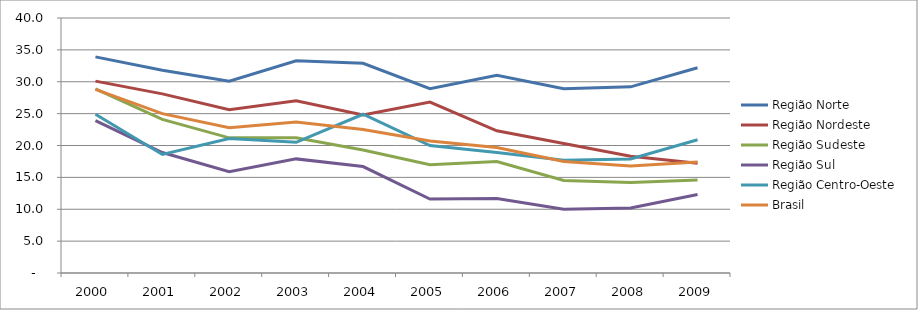
| Category | Região Norte | Região Nordeste | Região Sudeste | Região Sul | Região Centro-Oeste | Brasil |
|---|---|---|---|---|---|---|
| 2000.0 | 33.9 | 30.1 | 28.9 | 23.9 | 24.9 | 28.8 |
| 2001.0 | 31.8 | 28.1 | 24.1 | 18.9 | 18.6 | 25 |
| 2002.0 | 30.1 | 25.6 | 21.2 | 15.9 | 21.1 | 22.8 |
| 2003.0 | 33.3 | 27 | 21.2 | 17.9 | 20.5 | 23.7 |
| 2004.0 | 32.9 | 24.8 | 19.3 | 16.7 | 24.9 | 22.5 |
| 2005.0 | 28.9 | 26.8 | 17 | 11.6 | 20 | 20.7 |
| 2006.0 | 31 | 22.3 | 17.5 | 11.7 | 18.9 | 19.7 |
| 2007.0 | 28.9 | 20.3 | 14.5 | 10 | 17.7 | 17.5 |
| 2008.0 | 29.2 | 18.3 | 14.2 | 10.2 | 17.9 | 16.8 |
| 2009.0 | 32.2 | 17.2 | 14.6 | 12.3 | 20.9 | 17.4 |